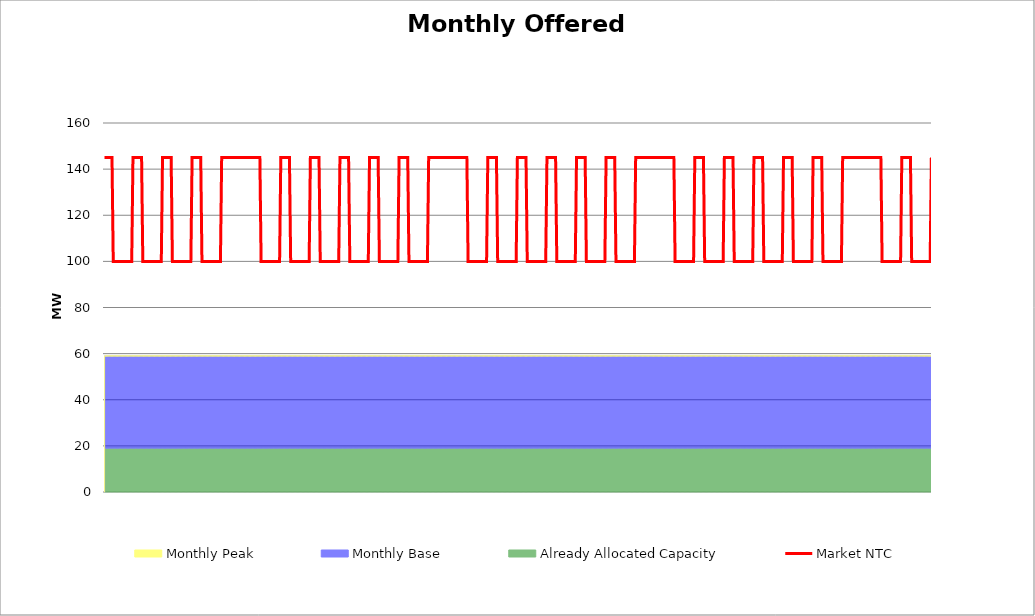
| Category | Market NTC |
|---|---|
| 0 | 145 |
| 1 | 145 |
| 2 | 145 |
| 3 | 145 |
| 4 | 145 |
| 5 | 145 |
| 6 | 145 |
| 7 | 100 |
| 8 | 100 |
| 9 | 100 |
| 10 | 100 |
| 11 | 100 |
| 12 | 100 |
| 13 | 100 |
| 14 | 100 |
| 15 | 100 |
| 16 | 100 |
| 17 | 100 |
| 18 | 100 |
| 19 | 100 |
| 20 | 100 |
| 21 | 100 |
| 22 | 100 |
| 23 | 145 |
| 24 | 145 |
| 25 | 145 |
| 26 | 145 |
| 27 | 145 |
| 28 | 145 |
| 29 | 145 |
| 30 | 145 |
| 31 | 100 |
| 32 | 100 |
| 33 | 100 |
| 34 | 100 |
| 35 | 100 |
| 36 | 100 |
| 37 | 100 |
| 38 | 100 |
| 39 | 100 |
| 40 | 100 |
| 41 | 100 |
| 42 | 100 |
| 43 | 100 |
| 44 | 100 |
| 45 | 100 |
| 46 | 100 |
| 47 | 145 |
| 48 | 145 |
| 49 | 145 |
| 50 | 145 |
| 51 | 145 |
| 52 | 145 |
| 53 | 145 |
| 54 | 145 |
| 55 | 100 |
| 56 | 100 |
| 57 | 100 |
| 58 | 100 |
| 59 | 100 |
| 60 | 100 |
| 61 | 100 |
| 62 | 100 |
| 63 | 100 |
| 64 | 100 |
| 65 | 100 |
| 66 | 100 |
| 67 | 100 |
| 68 | 100 |
| 69 | 100 |
| 70 | 100 |
| 71 | 145 |
| 72 | 145 |
| 73 | 145 |
| 74 | 145 |
| 75 | 145 |
| 76 | 145 |
| 77 | 145 |
| 78 | 145 |
| 79 | 100 |
| 80 | 100 |
| 81 | 100 |
| 82 | 100 |
| 83 | 100 |
| 84 | 100 |
| 85 | 100 |
| 86 | 100 |
| 87 | 100 |
| 88 | 100 |
| 89 | 100 |
| 90 | 100 |
| 91 | 100 |
| 92 | 100 |
| 93 | 100 |
| 94 | 100 |
| 95 | 145 |
| 96 | 145 |
| 97 | 145 |
| 98 | 145 |
| 99 | 145 |
| 100 | 145 |
| 101 | 145 |
| 102 | 145 |
| 103 | 145 |
| 104 | 145 |
| 105 | 145 |
| 106 | 145 |
| 107 | 145 |
| 108 | 145 |
| 109 | 145 |
| 110 | 145 |
| 111 | 145 |
| 112 | 145 |
| 113 | 145 |
| 114 | 145 |
| 115 | 145 |
| 116 | 145 |
| 117 | 145 |
| 118 | 145 |
| 119 | 145 |
| 120 | 145 |
| 121 | 145 |
| 122 | 145 |
| 123 | 145 |
| 124 | 145 |
| 125 | 145 |
| 126 | 145 |
| 127 | 100 |
| 128 | 100 |
| 129 | 100 |
| 130 | 100 |
| 131 | 100 |
| 132 | 100 |
| 133 | 100 |
| 134 | 100 |
| 135 | 100 |
| 136 | 100 |
| 137 | 100 |
| 138 | 100 |
| 139 | 100 |
| 140 | 100 |
| 141 | 100 |
| 142 | 100 |
| 143 | 145 |
| 144 | 145 |
| 145 | 145 |
| 146 | 145 |
| 147 | 145 |
| 148 | 145 |
| 149 | 145 |
| 150 | 145 |
| 151 | 100 |
| 152 | 100 |
| 153 | 100 |
| 154 | 100 |
| 155 | 100 |
| 156 | 100 |
| 157 | 100 |
| 158 | 100 |
| 159 | 100 |
| 160 | 100 |
| 161 | 100 |
| 162 | 100 |
| 163 | 100 |
| 164 | 100 |
| 165 | 100 |
| 166 | 100 |
| 167 | 145 |
| 168 | 145 |
| 169 | 145 |
| 170 | 145 |
| 171 | 145 |
| 172 | 145 |
| 173 | 145 |
| 174 | 145 |
| 175 | 100 |
| 176 | 100 |
| 177 | 100 |
| 178 | 100 |
| 179 | 100 |
| 180 | 100 |
| 181 | 100 |
| 182 | 100 |
| 183 | 100 |
| 184 | 100 |
| 185 | 100 |
| 186 | 100 |
| 187 | 100 |
| 188 | 100 |
| 189 | 100 |
| 190 | 100 |
| 191 | 145 |
| 192 | 145 |
| 193 | 145 |
| 194 | 145 |
| 195 | 145 |
| 196 | 145 |
| 197 | 145 |
| 198 | 145 |
| 199 | 100 |
| 200 | 100 |
| 201 | 100 |
| 202 | 100 |
| 203 | 100 |
| 204 | 100 |
| 205 | 100 |
| 206 | 100 |
| 207 | 100 |
| 208 | 100 |
| 209 | 100 |
| 210 | 100 |
| 211 | 100 |
| 212 | 100 |
| 213 | 100 |
| 214 | 100 |
| 215 | 145 |
| 216 | 145 |
| 217 | 145 |
| 218 | 145 |
| 219 | 145 |
| 220 | 145 |
| 221 | 145 |
| 222 | 145 |
| 223 | 100 |
| 224 | 100 |
| 225 | 100 |
| 226 | 100 |
| 227 | 100 |
| 228 | 100 |
| 229 | 100 |
| 230 | 100 |
| 231 | 100 |
| 232 | 100 |
| 233 | 100 |
| 234 | 100 |
| 235 | 100 |
| 236 | 100 |
| 237 | 100 |
| 238 | 100 |
| 239 | 145 |
| 240 | 145 |
| 241 | 145 |
| 242 | 145 |
| 243 | 145 |
| 244 | 145 |
| 245 | 145 |
| 246 | 145 |
| 247 | 100 |
| 248 | 100 |
| 249 | 100 |
| 250 | 100 |
| 251 | 100 |
| 252 | 100 |
| 253 | 100 |
| 254 | 100 |
| 255 | 100 |
| 256 | 100 |
| 257 | 100 |
| 258 | 100 |
| 259 | 100 |
| 260 | 100 |
| 261 | 100 |
| 262 | 100 |
| 263 | 145 |
| 264 | 145 |
| 265 | 145 |
| 266 | 145 |
| 267 | 145 |
| 268 | 145 |
| 269 | 145 |
| 270 | 145 |
| 271 | 145 |
| 272 | 145 |
| 273 | 145 |
| 274 | 145 |
| 275 | 145 |
| 276 | 145 |
| 277 | 145 |
| 278 | 145 |
| 279 | 145 |
| 280 | 145 |
| 281 | 145 |
| 282 | 145 |
| 283 | 145 |
| 284 | 145 |
| 285 | 145 |
| 286 | 145 |
| 287 | 145 |
| 288 | 145 |
| 289 | 145 |
| 290 | 145 |
| 291 | 145 |
| 292 | 145 |
| 293 | 145 |
| 294 | 145 |
| 295 | 100 |
| 296 | 100 |
| 297 | 100 |
| 298 | 100 |
| 299 | 100 |
| 300 | 100 |
| 301 | 100 |
| 302 | 100 |
| 303 | 100 |
| 304 | 100 |
| 305 | 100 |
| 306 | 100 |
| 307 | 100 |
| 308 | 100 |
| 309 | 100 |
| 310 | 100 |
| 311 | 145 |
| 312 | 145 |
| 313 | 145 |
| 314 | 145 |
| 315 | 145 |
| 316 | 145 |
| 317 | 145 |
| 318 | 145 |
| 319 | 100 |
| 320 | 100 |
| 321 | 100 |
| 322 | 100 |
| 323 | 100 |
| 324 | 100 |
| 325 | 100 |
| 326 | 100 |
| 327 | 100 |
| 328 | 100 |
| 329 | 100 |
| 330 | 100 |
| 331 | 100 |
| 332 | 100 |
| 333 | 100 |
| 334 | 100 |
| 335 | 145 |
| 336 | 145 |
| 337 | 145 |
| 338 | 145 |
| 339 | 145 |
| 340 | 145 |
| 341 | 145 |
| 342 | 145 |
| 343 | 100 |
| 344 | 100 |
| 345 | 100 |
| 346 | 100 |
| 347 | 100 |
| 348 | 100 |
| 349 | 100 |
| 350 | 100 |
| 351 | 100 |
| 352 | 100 |
| 353 | 100 |
| 354 | 100 |
| 355 | 100 |
| 356 | 100 |
| 357 | 100 |
| 358 | 100 |
| 359 | 145 |
| 360 | 145 |
| 361 | 145 |
| 362 | 145 |
| 363 | 145 |
| 364 | 145 |
| 365 | 145 |
| 366 | 145 |
| 367 | 100 |
| 368 | 100 |
| 369 | 100 |
| 370 | 100 |
| 371 | 100 |
| 372 | 100 |
| 373 | 100 |
| 374 | 100 |
| 375 | 100 |
| 376 | 100 |
| 377 | 100 |
| 378 | 100 |
| 379 | 100 |
| 380 | 100 |
| 381 | 100 |
| 382 | 100 |
| 383 | 145 |
| 384 | 145 |
| 385 | 145 |
| 386 | 145 |
| 387 | 145 |
| 388 | 145 |
| 389 | 145 |
| 390 | 145 |
| 391 | 100 |
| 392 | 100 |
| 393 | 100 |
| 394 | 100 |
| 395 | 100 |
| 396 | 100 |
| 397 | 100 |
| 398 | 100 |
| 399 | 100 |
| 400 | 100 |
| 401 | 100 |
| 402 | 100 |
| 403 | 100 |
| 404 | 100 |
| 405 | 100 |
| 406 | 100 |
| 407 | 145 |
| 408 | 145 |
| 409 | 145 |
| 410 | 145 |
| 411 | 145 |
| 412 | 145 |
| 413 | 145 |
| 414 | 145 |
| 415 | 100 |
| 416 | 100 |
| 417 | 100 |
| 418 | 100 |
| 419 | 100 |
| 420 | 100 |
| 421 | 100 |
| 422 | 100 |
| 423 | 100 |
| 424 | 100 |
| 425 | 100 |
| 426 | 100 |
| 427 | 100 |
| 428 | 100 |
| 429 | 100 |
| 430 | 100 |
| 431 | 145 |
| 432 | 145 |
| 433 | 145 |
| 434 | 145 |
| 435 | 145 |
| 436 | 145 |
| 437 | 145 |
| 438 | 145 |
| 439 | 145 |
| 440 | 145 |
| 441 | 145 |
| 442 | 145 |
| 443 | 145 |
| 444 | 145 |
| 445 | 145 |
| 446 | 145 |
| 447 | 145 |
| 448 | 145 |
| 449 | 145 |
| 450 | 145 |
| 451 | 145 |
| 452 | 145 |
| 453 | 145 |
| 454 | 145 |
| 455 | 145 |
| 456 | 145 |
| 457 | 145 |
| 458 | 145 |
| 459 | 145 |
| 460 | 145 |
| 461 | 145 |
| 462 | 145 |
| 463 | 100 |
| 464 | 100 |
| 465 | 100 |
| 466 | 100 |
| 467 | 100 |
| 468 | 100 |
| 469 | 100 |
| 470 | 100 |
| 471 | 100 |
| 472 | 100 |
| 473 | 100 |
| 474 | 100 |
| 475 | 100 |
| 476 | 100 |
| 477 | 100 |
| 478 | 100 |
| 479 | 145 |
| 480 | 145 |
| 481 | 145 |
| 482 | 145 |
| 483 | 145 |
| 484 | 145 |
| 485 | 145 |
| 486 | 145 |
| 487 | 100 |
| 488 | 100 |
| 489 | 100 |
| 490 | 100 |
| 491 | 100 |
| 492 | 100 |
| 493 | 100 |
| 494 | 100 |
| 495 | 100 |
| 496 | 100 |
| 497 | 100 |
| 498 | 100 |
| 499 | 100 |
| 500 | 100 |
| 501 | 100 |
| 502 | 100 |
| 503 | 145 |
| 504 | 145 |
| 505 | 145 |
| 506 | 145 |
| 507 | 145 |
| 508 | 145 |
| 509 | 145 |
| 510 | 145 |
| 511 | 100 |
| 512 | 100 |
| 513 | 100 |
| 514 | 100 |
| 515 | 100 |
| 516 | 100 |
| 517 | 100 |
| 518 | 100 |
| 519 | 100 |
| 520 | 100 |
| 521 | 100 |
| 522 | 100 |
| 523 | 100 |
| 524 | 100 |
| 525 | 100 |
| 526 | 100 |
| 527 | 145 |
| 528 | 145 |
| 529 | 145 |
| 530 | 145 |
| 531 | 145 |
| 532 | 145 |
| 533 | 145 |
| 534 | 145 |
| 535 | 100 |
| 536 | 100 |
| 537 | 100 |
| 538 | 100 |
| 539 | 100 |
| 540 | 100 |
| 541 | 100 |
| 542 | 100 |
| 543 | 100 |
| 544 | 100 |
| 545 | 100 |
| 546 | 100 |
| 547 | 100 |
| 548 | 100 |
| 549 | 100 |
| 550 | 100 |
| 551 | 145 |
| 552 | 145 |
| 553 | 145 |
| 554 | 145 |
| 555 | 145 |
| 556 | 145 |
| 557 | 145 |
| 558 | 145 |
| 559 | 100 |
| 560 | 100 |
| 561 | 100 |
| 562 | 100 |
| 563 | 100 |
| 564 | 100 |
| 565 | 100 |
| 566 | 100 |
| 567 | 100 |
| 568 | 100 |
| 569 | 100 |
| 570 | 100 |
| 571 | 100 |
| 572 | 100 |
| 573 | 100 |
| 574 | 100 |
| 575 | 145 |
| 576 | 145 |
| 577 | 145 |
| 578 | 145 |
| 579 | 145 |
| 580 | 145 |
| 581 | 145 |
| 582 | 145 |
| 583 | 100 |
| 584 | 100 |
| 585 | 100 |
| 586 | 100 |
| 587 | 100 |
| 588 | 100 |
| 589 | 100 |
| 590 | 100 |
| 591 | 100 |
| 592 | 100 |
| 593 | 100 |
| 594 | 100 |
| 595 | 100 |
| 596 | 100 |
| 597 | 100 |
| 598 | 100 |
| 599 | 145 |
| 600 | 145 |
| 601 | 145 |
| 602 | 145 |
| 603 | 145 |
| 604 | 145 |
| 605 | 145 |
| 606 | 145 |
| 607 | 145 |
| 608 | 145 |
| 609 | 145 |
| 610 | 145 |
| 611 | 145 |
| 612 | 145 |
| 613 | 145 |
| 614 | 145 |
| 615 | 145 |
| 616 | 145 |
| 617 | 145 |
| 618 | 145 |
| 619 | 145 |
| 620 | 145 |
| 621 | 145 |
| 622 | 145 |
| 623 | 145 |
| 624 | 145 |
| 625 | 145 |
| 626 | 145 |
| 627 | 145 |
| 628 | 145 |
| 629 | 145 |
| 630 | 145 |
| 631 | 100 |
| 632 | 100 |
| 633 | 100 |
| 634 | 100 |
| 635 | 100 |
| 636 | 100 |
| 637 | 100 |
| 638 | 100 |
| 639 | 100 |
| 640 | 100 |
| 641 | 100 |
| 642 | 100 |
| 643 | 100 |
| 644 | 100 |
| 645 | 100 |
| 646 | 100 |
| 647 | 145 |
| 648 | 145 |
| 649 | 145 |
| 650 | 145 |
| 651 | 145 |
| 652 | 145 |
| 653 | 145 |
| 654 | 145 |
| 655 | 100 |
| 656 | 100 |
| 657 | 100 |
| 658 | 100 |
| 659 | 100 |
| 660 | 100 |
| 661 | 100 |
| 662 | 100 |
| 663 | 100 |
| 664 | 100 |
| 665 | 100 |
| 666 | 100 |
| 667 | 100 |
| 668 | 100 |
| 669 | 100 |
| 670 | 100 |
| 671 | 145 |